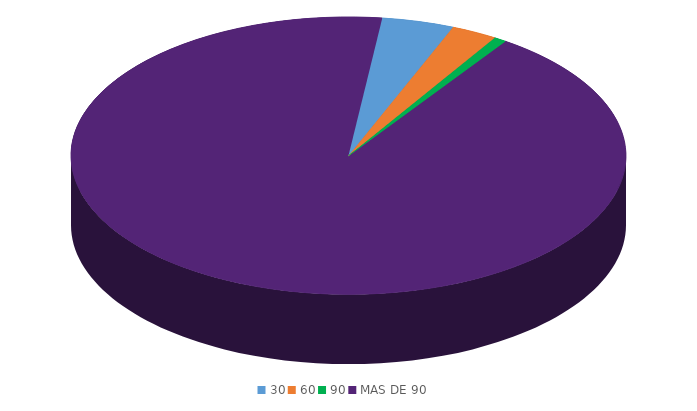
| Category | Series 0 |
|---|---|
| 30 | 1341733.8 |
| 60 | 862543.1 |
| 90 | 223622.3 |
| MAS DE 90 | 29518142.9 |